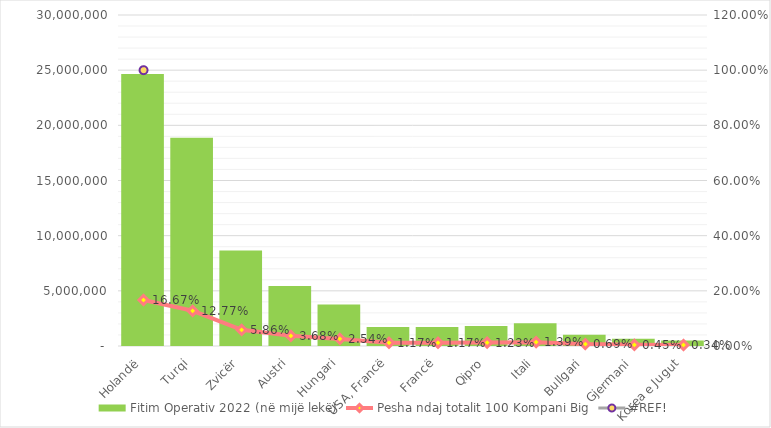
| Category | Fitim Operativ 2022 (në mijë lekë) |
|---|---|
| Holandë | 24659160.253 |
| Turqi | 18877169.045 |
| Zvicër | 8661664 |
| Austri | 5439832.643 |
| Hungari | 3758883 |
| USA, Francë | 1731259.875 |
| Francë | 1725808.306 |
| Qipro | 1818269 |
| Itali | 2060361.86 |
| Bullgari | 1024507 |
| Gjermani | 665690.965 |
| Korea e Jugut | 497821.742 |